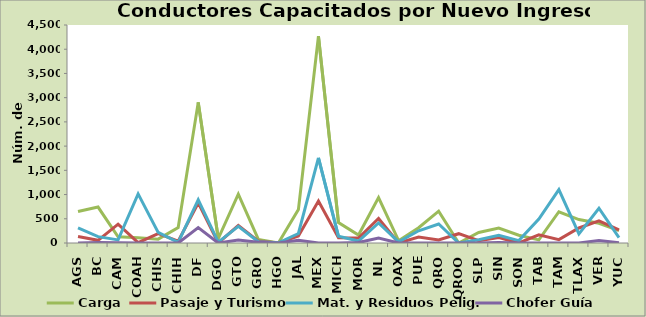
| Category | Carga | Pasaje y Turismo | Mat. y Residuos Pelig. | Chofer Guía |
|---|---|---|---|---|
| AGS | 651 | 136 | 313 | 0 |
| BC | 742 | 55 | 131 | 11 |
| CAM | 127 | 389 | 64 | 5 |
| COAH | 107 | 6 | 1014 | 0 |
| CHIS | 80 | 194 | 220 | 0 |
| CHIH | 319 | 39 | 12 | 0 |
| DF | 2903 | 827 | 893 | 317 |
| DGO | 93 | 0 | 19 | 0 |
| GTO | 1010 | 360 | 344 | 61 |
| GRO | 74 | 39 | 25 | 14 |
| HGO | 0 | 1 | 5 | 0 |
| JAL | 689 | 145 | 196 | 58 |
| MEX | 4269 | 865 | 1756 | 0 |
| MICH | 422 | 108 | 138 | 0 |
| MOR | 164 | 103 | 40 | 9 |
| NL | 937 | 506 | 414 | 102 |
| OAX | 48 | 0 | 22 | 0 |
| PUE | 316 | 125 | 252 | 0 |
| QRO | 657 | 62 | 393 | 0 |
| QROO | 0 | 192 | 0 | 0 |
| SLP | 217 | 47 | 66 | 0 |
| SIN | 308 | 112 | 157 | 10 |
| SON | 160 | 0 | 50 | 0 |
| TAB | 64 | 169 | 495 | 0 |
| TAM | 645 | 69 | 1101 | 0 |
| TLAX | 484 | 310 | 189 | 0 |
| VER | 407 | 455 | 717 | 51 |
| YUC | 256 | 269 | 111 | 4 |